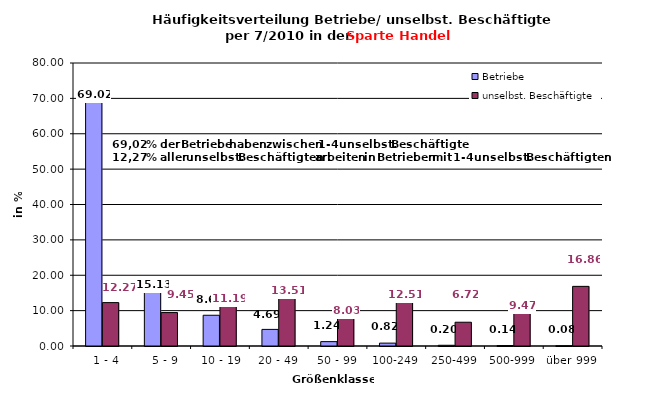
| Category | Betriebe | unselbst. Beschäftigte |
|---|---|---|
|   1 - 4 | 69.02 | 12.269 |
|   5 - 9 | 15.127 | 9.452 |
|  10 - 19 | 8.691 | 11.189 |
| 20 - 49 | 4.691 | 13.508 |
| 50 - 99 | 1.235 | 8.03 |
| 100-249 | 0.816 | 12.506 |
| 250-499 | 0.204 | 6.721 |
| 500-999 | 0.136 | 9.466 |
| über 999 | 0.079 | 16.859 |